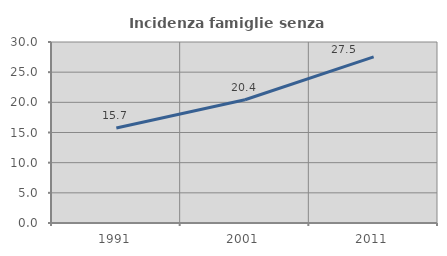
| Category | Incidenza famiglie senza nuclei |
|---|---|
| 1991.0 | 15.741 |
| 2001.0 | 20.436 |
| 2011.0 | 27.537 |